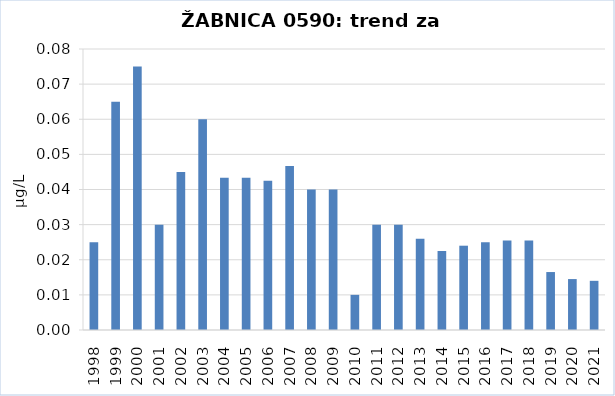
| Category | Vsota |
|---|---|
| 1998 | 0.025 |
| 1999 | 0.065 |
| 2000 | 0.075 |
| 2001 | 0.03 |
| 2002 | 0.045 |
| 2003 | 0.06 |
| 2004 | 0.043 |
| 2005 | 0.043 |
| 2006 | 0.042 |
| 2007 | 0.047 |
| 2008 | 0.04 |
| 2009 | 0.04 |
| 2010 | 0.01 |
| 2011 | 0.03 |
| 2012 | 0.03 |
| 2013 | 0.026 |
| 2014 | 0.022 |
| 2015 | 0.024 |
| 2016 | 0.025 |
| 2017 | 0.026 |
| 2018 | 0.026 |
| 2019 | 0.016 |
| 2020 | 0.014 |
| 2021 | 0.014 |